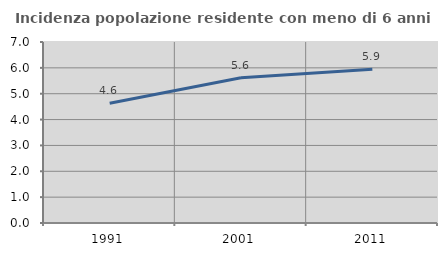
| Category | Incidenza popolazione residente con meno di 6 anni |
|---|---|
| 1991.0 | 4.633 |
| 2001.0 | 5.62 |
| 2011.0 | 5.949 |